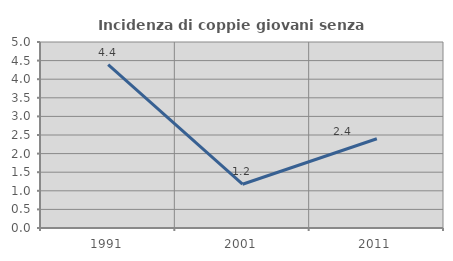
| Category | Incidenza di coppie giovani senza figli |
|---|---|
| 1991.0 | 4.392 |
| 2001.0 | 1.176 |
| 2011.0 | 2.4 |